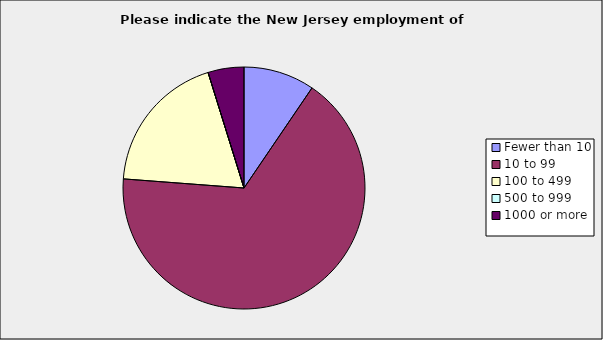
| Category | Series 0 |
|---|---|
| Fewer than 10 | 0.095 |
| 10 to 99 | 0.667 |
| 100 to 499 | 0.19 |
| 500 to 999 | 0 |
| 1000 or more | 0.048 |